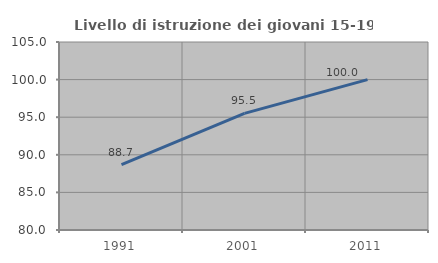
| Category | Livello di istruzione dei giovani 15-19 anni |
|---|---|
| 1991.0 | 88.679 |
| 2001.0 | 95.506 |
| 2011.0 | 100 |